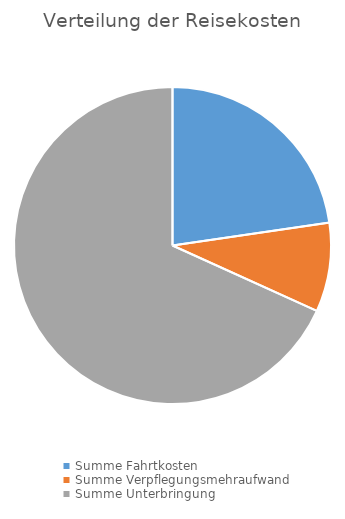
| Category | Series 0 |
|---|---|
| Summe Fahrtkosten | 30 |
| Summe Verpflegungsmehraufwand | 12 |
| Summe Unterbringung | 90.2 |